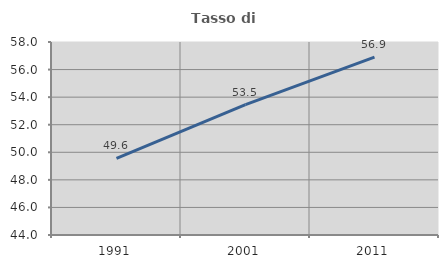
| Category | Tasso di occupazione   |
|---|---|
| 1991.0 | 49.563 |
| 2001.0 | 53.454 |
| 2011.0 | 56.903 |